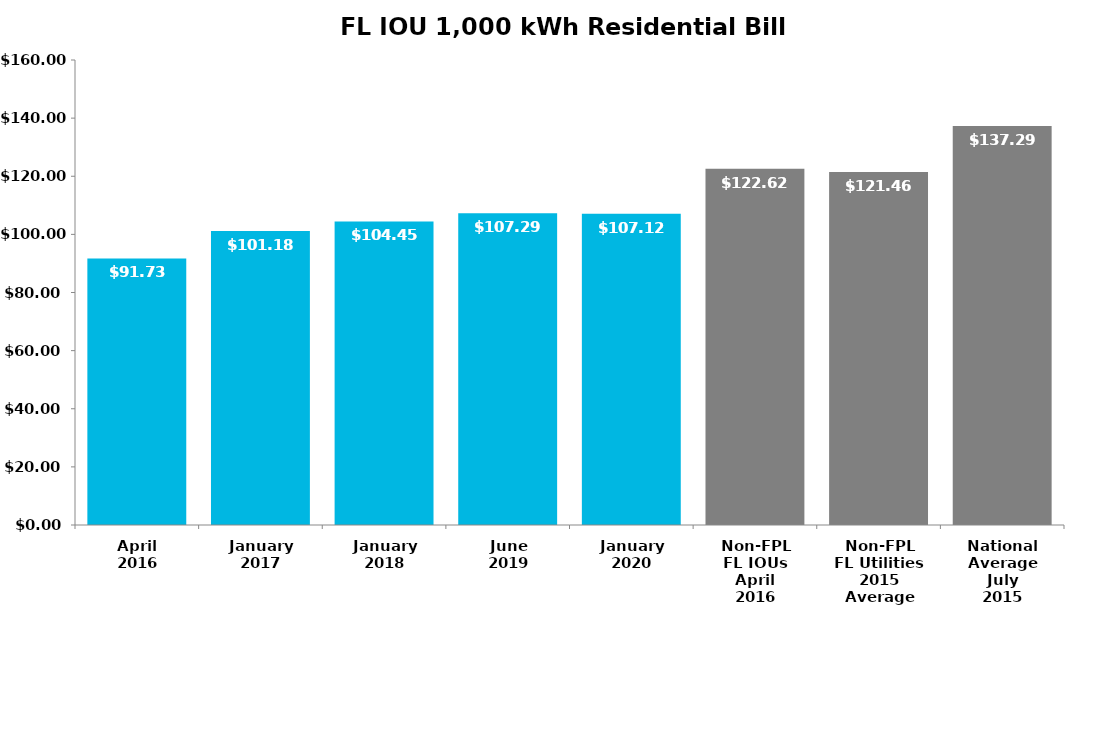
| Category | Total | Series 1 | Series 2 | Series 3 |
|---|---|---|---|---|
| April
2016 | 91.73 |  |  |  |
| January
2017 | 101.18 |  |  |  |
| January
2018 | 104.45 |  |  |  |
| June
2019 | 107.29 |  |  |  |
| January
2020 | 107.12 |  |  |  |
| Non-FPL
FL IOUs
April
2016 | 122.62 |  |  |  |
| Non-FPL
FL Utilities
2015 Average | 121.46 |  |  |  |
| National
Average
July
2015 | 137.29 |  |  |  |